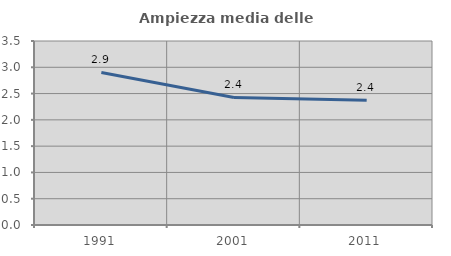
| Category | Ampiezza media delle famiglie |
|---|---|
| 1991.0 | 2.901 |
| 2001.0 | 2.426 |
| 2011.0 | 2.371 |